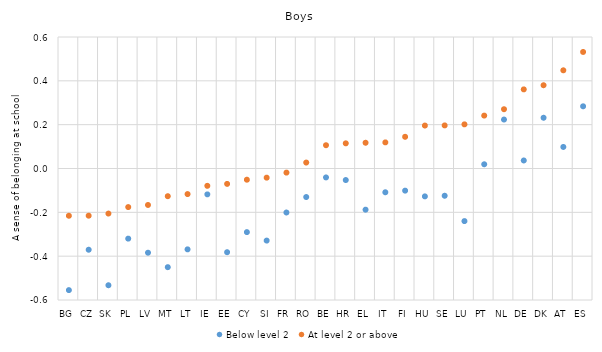
| Category | Below level 2 | At level 2 or above |
|---|---|---|
| BG | -0.555 | -0.216 |
| CZ | -0.371 | -0.215 |
| SK | -0.533 | -0.206 |
| PL | -0.32 | -0.176 |
| LV | -0.384 | -0.167 |
| MT | -0.45 | -0.126 |
| LT | -0.369 | -0.117 |
| IE | -0.118 | -0.079 |
| EE | -0.382 | -0.07 |
| CY | -0.29 | -0.051 |
| SI | -0.329 | -0.042 |
| FR | -0.201 | -0.019 |
| RO | -0.13 | 0.027 |
| BE | -0.041 | 0.106 |
| HR | -0.053 | 0.115 |
| EL | -0.188 | 0.117 |
| IT | -0.108 | 0.119 |
| FI | -0.101 | 0.145 |
| HU | -0.127 | 0.196 |
| SE | -0.124 | 0.197 |
| LU | -0.24 | 0.201 |
| PT | 0.019 | 0.241 |
| NL | 0.223 | 0.27 |
| DE | 0.037 | 0.361 |
| DK | 0.232 | 0.38 |
| AT | 0.098 | 0.448 |
| ES | 0.284 | 0.532 |